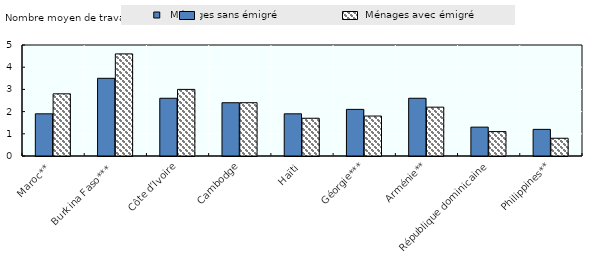
| Category |   Ménages sans émigré |   Ménages avec émigré |
|---|---|---|
| Maroc** | 1.9 | 2.8 |
| Burkina Faso*** | 3.5 | 4.6 |
| Côte d’Ivoire | 2.6 | 3 |
| Cambodge | 2.4 | 2.4 |
| Haïti | 1.9 | 1.7 |
| Géorgie*** | 2.1 | 1.8 |
| Arménie** | 2.6 | 2.2 |
| République dominicaine | 1.3 | 1.1 |
| Philippines** | 1.2 | 0.8 |